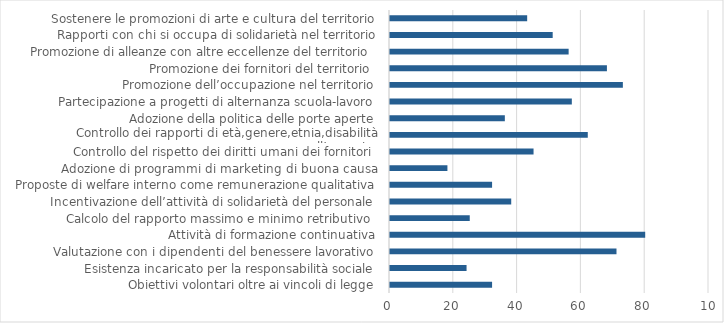
| Category | Series 6 |
|---|---|
| Obiettivi volontari oltre ai vincoli di legge | 32 |
| Esistenza incaricato per la responsabilità sociale | 24 |
| Valutazione con i dipendenti del benessere lavorativo | 71 |
| Attività di formazione continuativa | 80 |
|  Calcolo del rapporto massimo e minimo retributivo  | 25 |
|  Incentivazione dell’attività di solidarietà del personale | 38 |
|  Proposte di welfare interno come remunerazione qualitativa | 32 |
| Adozione di programmi di marketing di buona causa | 18 |
|  Controllo del rispetto dei diritti umani dei fornitori  | 45 |
| Controllo dei rapporti di età,genere,etnia,disabilità nell’organico | 62 |
|  Adozione della politica delle porte aperte | 36 |
| Partecipazione a progetti di alternanza scuola-lavoro | 57 |
| Promozione dell’occupazione nel territorio | 73 |
| Promozione dei fornitori del territorio  | 68 |
| Promozione di alleanze con altre eccellenze del territorio  | 56 |
| Rapporti con chi si occupa di solidarietà nel territorio | 51 |
| Sostenere le promozioni di arte e cultura del territorio | 43 |